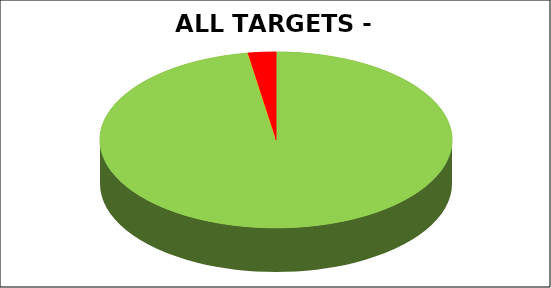
| Category | Series 0 |
|---|---|
| Green | 0.974 |
| Amber | 0 |
| Red | 0.026 |